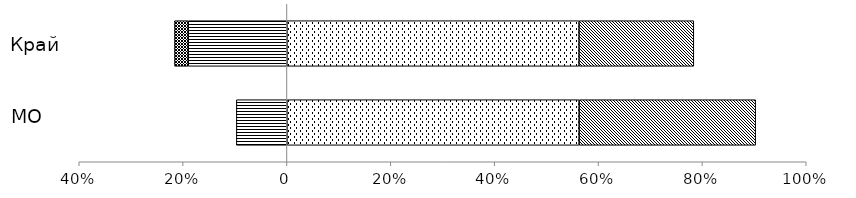
| Category | Пониженный | Недостаточный | Базовый | Повышенный |
|---|---|---|---|---|
|  | -0.097 | 0 | 0.563 | 0.34 |
|  | -0.19 | -0.026 | 0.562 | 0.221 |